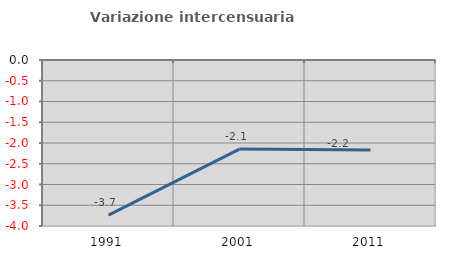
| Category | Variazione intercensuaria annua |
|---|---|
| 1991.0 | -3.736 |
| 2001.0 | -2.147 |
| 2011.0 | -2.17 |